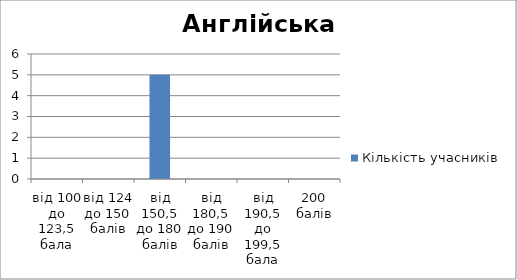
| Category | Кількість учасників |
|---|---|
| від 100 до 123,5 бала | 0 |
| від 124 до 150 балів | 0 |
| від 150,5 до 180 балів | 5 |
| від 180,5 до 190 балів | 0 |
| від 190,5 до 199,5 бала | 0 |
| 200 балів | 0 |